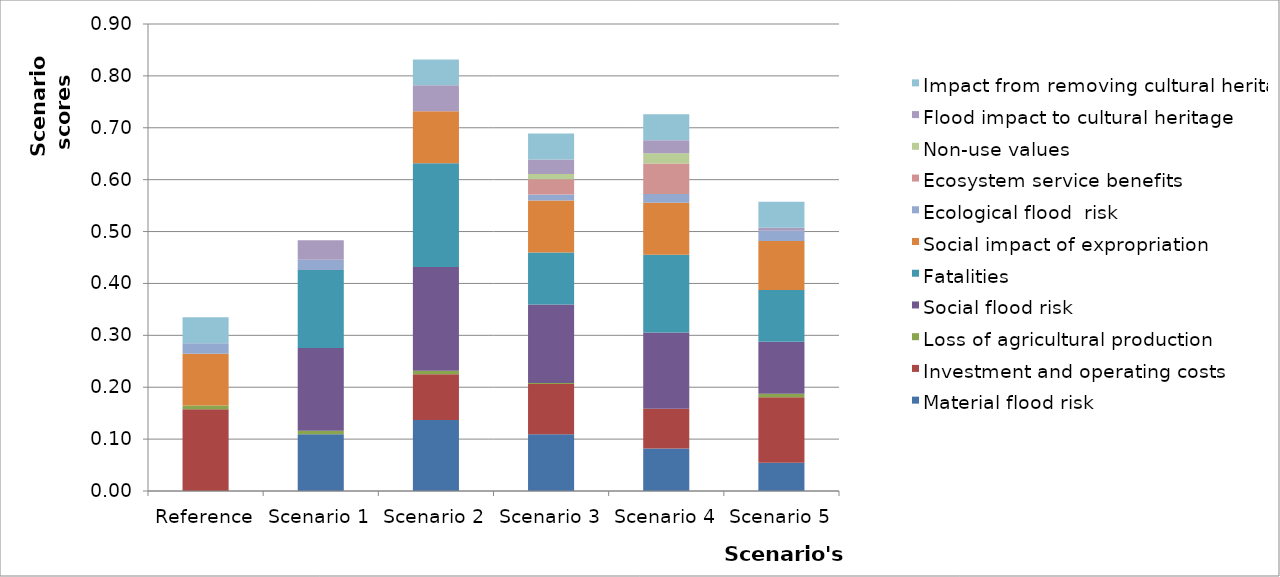
| Category | Material flood risk | Investment and operating costs | Loss of agricultural production  | Social flood risk | Fatalities | Social impact of expropriation | Ecological flood  risk | Ecosystem service benefits | Non-use values | Flood impact to cultural heritage | Impact from removing cultural heritage |
|---|---|---|---|---|---|---|---|---|---|---|---|
| Reference | 0 | 0.158 | 0.007 | 0 | 0 | 0.1 | 0.02 | 0 | 0 | 0 | 0.05 |
| Scenario 1 | 0.109 | 0 | 0.007 | 0.159 | 0.15 | 0 | 0.02 | 0 | 0 | 0.038 | 0 |
| Scenario 2 | 0.137 | 0.088 | 0.007 | 0.2 | 0.2 | 0.1 | 0 | 0 | 0 | 0.05 | 0.05 |
| Scenario 3 | 0.109 | 0.097 | 0.002 | 0.152 | 0.1 | 0.1 | 0.012 | 0.029 | 0.01 | 0.028 | 0.05 |
| Scenario 4 | 0.082 | 0.077 | 0 | 0.147 | 0.15 | 0.1 | 0.017 | 0.059 | 0.02 | 0.025 | 0.05 |
| Scenario 5 | 0.055 | 0.126 | 0.007 | 0.1 | 0.1 | 0.094 | 0.02 | 0 | 0 | 0.005 | 0.05 |